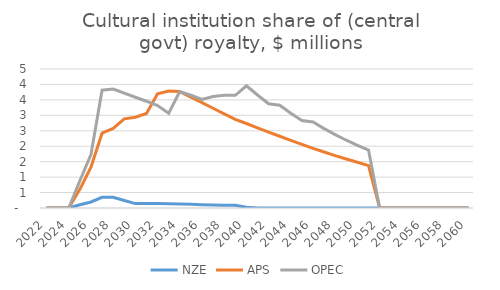
| Category | NZE | APS | OPEC |
|---|---|---|---|
| 2022.0 | 0 | 0 | 0 |
| 2023.0 | 0 | 0 | 0 |
| 2024.0 | 0 | 0 | 0 |
| 2025.0 | 0.105 | 0.605 | 0.884 |
| 2026.0 | 0.195 | 1.325 | 1.729 |
| 2027.0 | 0.345 | 2.421 | 3.816 |
| 2028.0 | 0.345 | 2.576 | 3.852 |
| 2029.0 | 0.244 | 2.887 | 3.717 |
| 2030.0 | 0.143 | 2.938 | 3.585 |
| 2031.0 | 0.143 | 3.062 | 3.457 |
| 2032.0 | 0.142 | 3.698 | 3.315 |
| 2033.0 | 0.137 | 3.786 | 3.067 |
| 2034.0 | 0.128 | 3.768 | 3.768 |
| 2035.0 | 0.118 | 3.59 | 3.649 |
| 2036.0 | 0.109 | 3.409 | 3.516 |
| 2037.0 | 0.101 | 3.228 | 3.611 |
| 2038.0 | 0.093 | 3.049 | 3.652 |
| 2039.0 | 0.085 | 2.872 | 3.647 |
| 2040.0 | 0.023 | 2.735 | 3.955 |
| 2041.0 | 0 | 2.597 | 3.659 |
| 2042.0 | 0 | 2.459 | 3.375 |
| 2043.0 | 0 | 2.322 | 3.327 |
| 2044.0 | 0 | 2.188 | 3.07 |
| 2045.0 | 0 | 2.058 | 2.833 |
| 2046.0 | 0 | 1.933 | 2.783 |
| 2047.0 | 0 | 1.812 | 2.57 |
| 2048.0 | 0 | 1.697 | 2.374 |
| 2049.0 | 0 | 1.586 | 2.194 |
| 2050.0 | 0 | 1.482 | 2.028 |
| 2051.0 | 0 | 1.37 | 1.876 |
| 2052.0 | 0 | 0 | 0 |
| 2053.0 | 0 | 0 | 0 |
| 2054.0 | 0 | 0 | 0 |
| 2055.0 | 0 | 0 | 0 |
| 2056.0 | 0 | 0 | 0 |
| 2057.0 | 0 | 0 | 0 |
| 2058.0 | 0 | 0 | 0 |
| 2059.0 | 0 | 0 | 0 |
| 2060.0 | 0 | 0 | 0 |